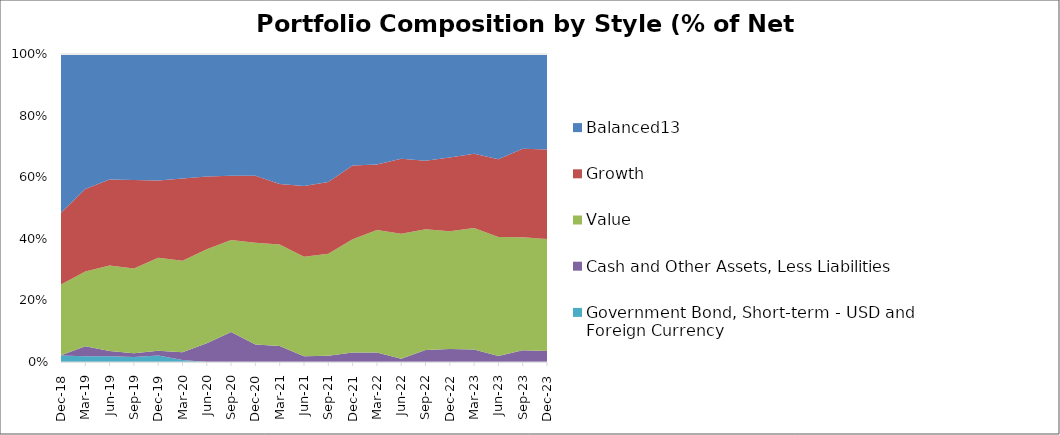
| Category | Government Bond, Short-term - USD and Foreign Currency | Cash and Other Assets, Less Liabilities | Value | Growth | Balanced13 |
|---|---|---|---|---|---|
| 2018-12-31 | 2.07 | 0.12 | 22.95 | 23.35 | 51.51 |
| 2019-03-31 | 1.88 | 3.24 | 24.23 | 26.83 | 43.82 |
| 2019-06-30 | 1.84 | 1.71 | 27.78 | 27.96 | 40.71 |
| 2019-09-30 | 1.64 | 1.24 | 27.46 | 28.77 | 40.89 |
| 2019-12-31 | 2.07 | 1.62 | 30.17 | 25.09 | 41.05 |
| 2020-03-31 | 0.64 | 2.52 | 29.72 | 26.66 | 40.46 |
| 2020-06-30 | 0 | 6.07 | 30.54 | 23.58 | 39.81 |
| 2020-09-30 | 0 | 9.73 | 29.88 | 20.87 | 39.52 |
| 2020-12-31 | 0 | 5.7 | 32.98 | 21.8 | 39.52 |
| 2021-03-31 | 0 | 5.21 | 32.93 | 19.65 | 42.21 |
| 2021-06-30 | 0 | 1.86 | 32.32 | 22.93 | 42.89 |
| 2021-09-30 | 0 | 2.05 | 33.13 | 23.28 | 41.54 |
| 2021-12-31 | 0 | 3.06 | 36.79 | 23.91 | 36.24 |
| 2022-03-31 | 0 | 3.11 | 39.72 | 21.31 | 35.86 |
| 2022-06-30 | 0 | 1.04 | 40.61 | 24.35 | 34 |
| 2022-09-30 | 0 | 3.87 | 39.24 | 22.27 | 34.62 |
| 2022-12-31 | 0 | 4.21 | 38.23 | 23.92 | 33.64 |
| 2023-03-31 | 0 | 4.08 | 39.46 | 24.08 | 32.38 |
| 2023-06-30 | 0 | 1.94 | 38.63 | 25.22 | 34.21 |
| 2023-09-30 | 0 | 3.81 | 36.67 | 28.72 | 30.8 |
| 2023-12-31 | 0 | 3.58 | 36.34 | 29.06 | 31.02 |